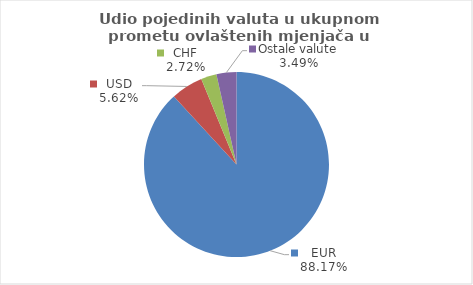
| Category | Series 0 |
|---|---|
| EUR | 88.171 |
| USD | 5.616 |
| CHF | 2.723 |
| Ostale valute | 3.49 |